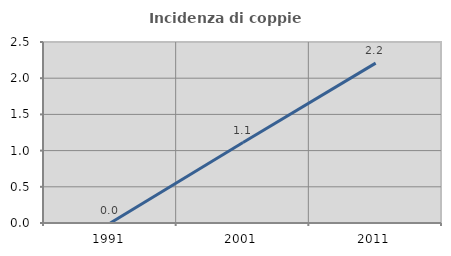
| Category | Incidenza di coppie miste |
|---|---|
| 1991.0 | 0 |
| 2001.0 | 1.111 |
| 2011.0 | 2.208 |